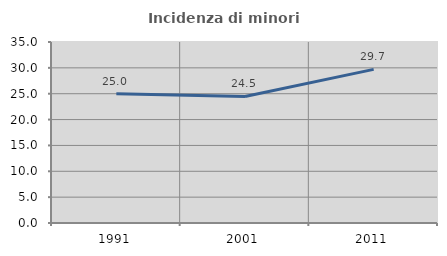
| Category | Incidenza di minori stranieri |
|---|---|
| 1991.0 | 25 |
| 2001.0 | 24.468 |
| 2011.0 | 29.703 |